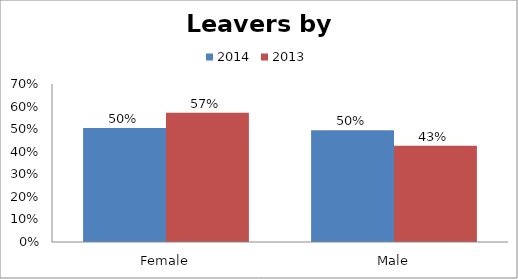
| Category | 2014 | 2013 |
|---|---|---|
| Female | 0.505 | 0.573 |
| Male | 0.495 | 0.427 |